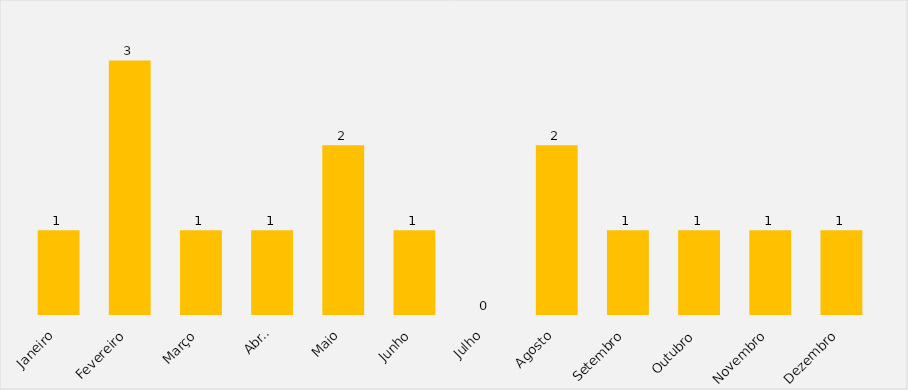
| Category | Series 0 |
|---|---|
| Janeiro | 1 |
| Fevereiro | 3 |
| Março | 1 |
| Abril | 1 |
| Maio | 2 |
| Junho | 1 |
| Julho | 0 |
| Agosto | 2 |
| Setembro | 1 |
| Outubro | 1 |
| Novembro | 1 |
| Dezembro | 1 |